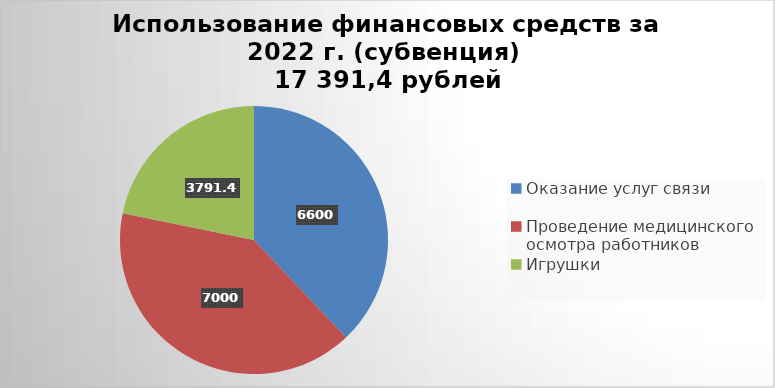
| Category | Series 0 |
|---|---|
| Оказание услуг связи | 6600 |
| Проведение медицинского осмотра работников | 7000 |
| Игрушки | 3791.4 |